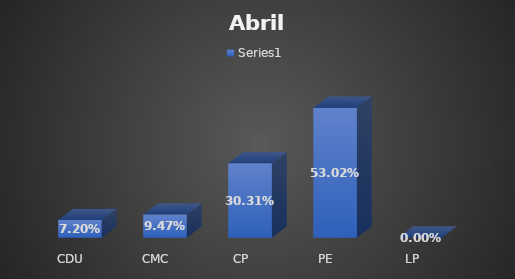
| Category | Series 0 |
|---|---|
| CDU | 0.072 |
| CMC | 0.095 |
| CP | 0.303 |
| PE | 0.53 |
| LP | 0 |